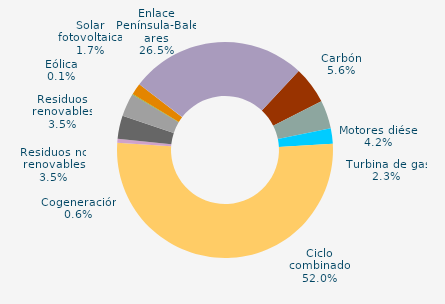
| Category | Series 0 |
|---|---|
| Carbón | 5.615 |
| Motores diésel | 4.208 |
| Turbina de gas | 2.327 |
| Ciclo combinado | 51.976 |
| Generación auxiliar | 0 |
| Cogeneración | 0.594 |
| Residuos no renovables | 3.458 |
| Residuos renovables | 3.458 |
| Eólica | 0.112 |
| Solar fotovoltaica | 1.721 |
| Otras renovables | 0.008 |
| Enlace Península-Baleares | 26.525 |